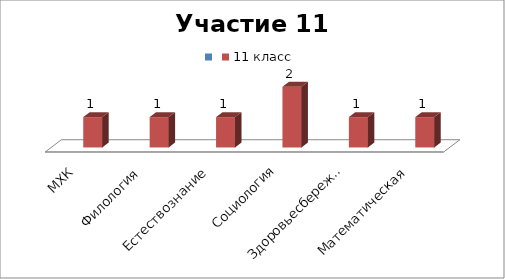
| Category | Series 0 | 11 класс |
|---|---|---|
| МХК |  | 1 |
| Филология |  | 1 |
| Естествознание |  | 1 |
| Социология |  | 2 |
| Здоровьесбережение |  | 1 |
| Математическая |  | 1 |